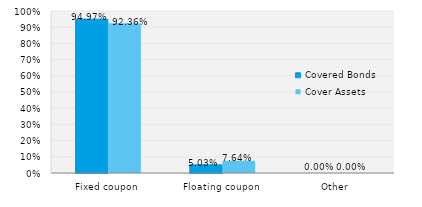
| Category | Covered Bonds | Cover Assets |
|---|---|---|
| Fixed coupon | 0.95 | 0.924 |
| Floating coupon | 0.05 | 0.076 |
| Other | 0 | 0 |